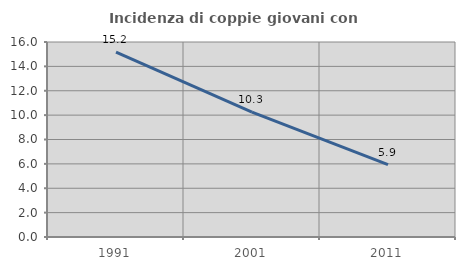
| Category | Incidenza di coppie giovani con figli |
|---|---|
| 1991.0 | 15.175 |
| 2001.0 | 10.254 |
| 2011.0 | 5.945 |